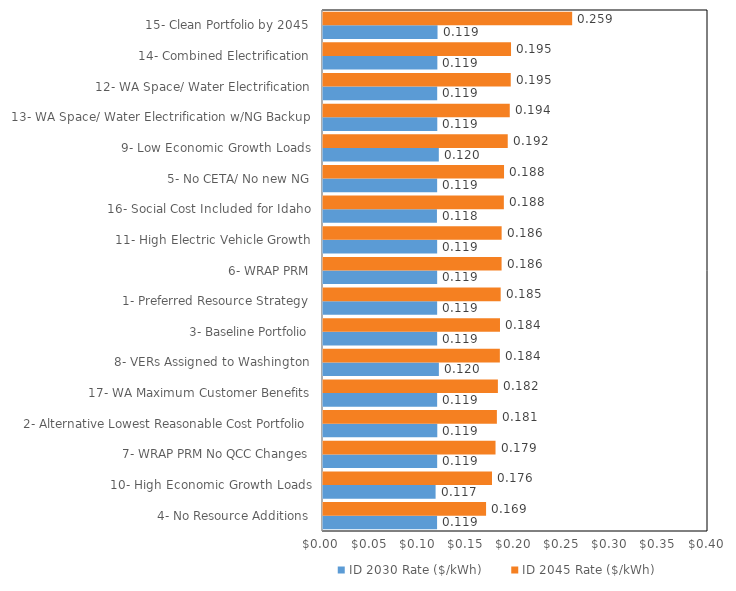
| Category | ID 2030 Rate ($/kWh) | ID 2045 Rate ($/kWh) |
|---|---|---|
| 4- No Resource Additions | 0.119 | 0.169 |
| 10- High Economic Growth Loads | 0.117 | 0.176 |
| 7- WRAP PRM No QCC Changes | 0.119 | 0.179 |
| 2- Alternative Lowest Reasonable Cost Portfolio | 0.119 | 0.181 |
| 17- WA Maximum Customer Benefits | 0.119 | 0.182 |
| 8- VERs Assigned to Washington | 0.12 | 0.184 |
| 3- Baseline Portfolio | 0.119 | 0.184 |
| 1- Preferred Resource Strategy | 0.119 | 0.185 |
| 6- WRAP PRM | 0.119 | 0.186 |
| 11- High Electric Vehicle Growth | 0.119 | 0.186 |
| 16- Social Cost Included for Idaho | 0.118 | 0.188 |
| 5- No CETA/ No new NG | 0.119 | 0.188 |
| 9- Low Economic Growth Loads | 0.12 | 0.192 |
| 13- WA Space/ Water Electrification w/NG Backup | 0.119 | 0.194 |
| 12- WA Space/ Water Electrification | 0.119 | 0.195 |
| 14- Combined Electrification | 0.119 | 0.195 |
| 15- Clean Portfolio by 2045 | 0.119 | 0.259 |